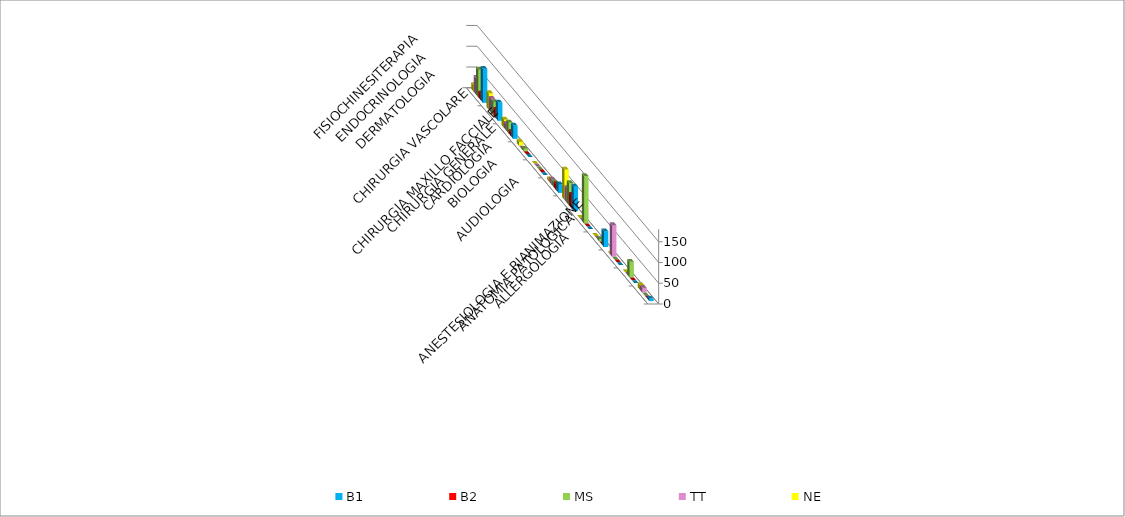
| Category | B1 | B2 | MS | TT | NE |
|---|---|---|---|---|---|
| ALLERGOLOGIA | 6 | 0 | 0 | 12 | 12 |
| ANATOMIA PATOLOGICA | 0 | 0 | 38 | 0 | 0 |
| ANESTESIOLOGIA E RIANIMAZIONE | 0 | 0 | 0 | 76 | 0 |
| AUDIOLOGIA | 38 | 0 | 6 | 0 | 0 |
| BIOLOGIA | 0 | 0 | 114 | 0 | 0 |
| CARDIOLOGIA | 59 | 32 | 54 | 35 | 73 |
| CHIRURGIA GENERALE | 21 | 14 | 12.5 | 12 | 6 |
| CHIRURGIA MAXILLO FACCIALE | 0 | 0 | 0 | 0 | 0 |
| CHIRURGIA VASCOLARE | 0 | 0 | 6 | 0 | 10 |
| DERMATOLOGIA | 32 | 10 | 26 | 16 | 20 |
| ENDOCRINOLOGIA | 44 | 20 | 32 | 33 | 40 |
| FISIOCHINESITERAPIA | 82 | 16 | 67 | 40 | 16 |